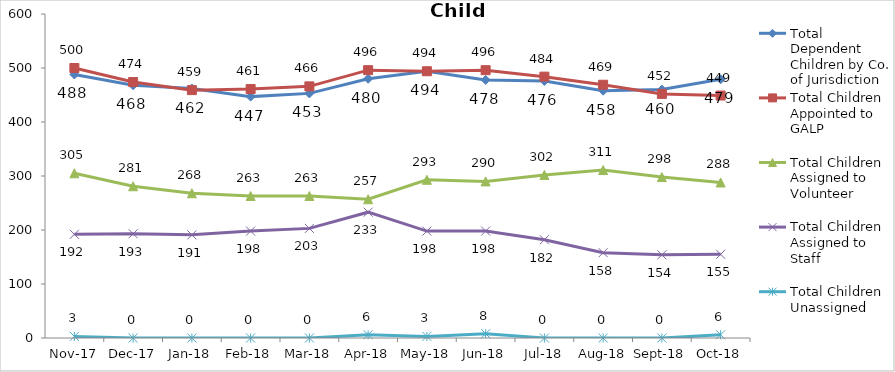
| Category | Total Dependent Children by Co. of Jurisdiction | Total Children Appointed to GALP | Total Children Assigned to Volunteer | Total Children Assigned to Staff | Total Children Unassigned |
|---|---|---|---|---|---|
| 2017-11-01 | 488 | 500 | 305 | 192 | 3 |
| 2017-12-01 | 468 | 474 | 281 | 193 | 0 |
| 2018-01-01 | 462 | 459 | 268 | 191 | 0 |
| 2018-02-01 | 447 | 461 | 263 | 198 | 0 |
| 2018-03-01 | 453 | 466 | 263 | 203 | 0 |
| 2018-04-01 | 480 | 496 | 257 | 233 | 6 |
| 2018-05-01 | 494 | 494 | 293 | 198 | 3 |
| 2018-06-01 | 478 | 496 | 290 | 198 | 8 |
| 2018-07-01 | 476 | 484 | 302 | 182 | 0 |
| 2018-08-01 | 458 | 469 | 311 | 158 | 0 |
| 2018-09-01 | 460 | 452 | 298 | 154 | 0 |
| 2018-10-01 | 479 | 449 | 288 | 155 | 6 |